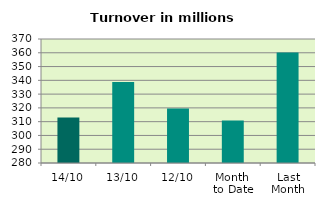
| Category | Series 0 |
|---|---|
| 14/10 | 313.05 |
| 13/10 | 338.88 |
| 12/10 | 319.587 |
| Month 
to Date | 310.792 |
| Last
Month | 360.198 |